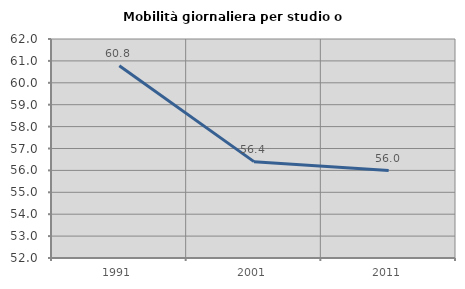
| Category | Mobilità giornaliera per studio o lavoro |
|---|---|
| 1991.0 | 60.779 |
| 2001.0 | 56.4 |
| 2011.0 | 55.991 |